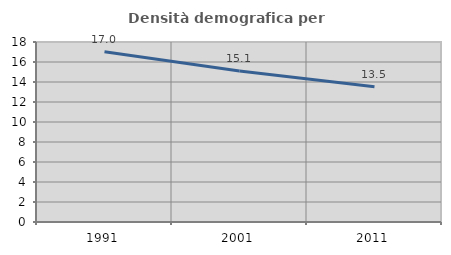
| Category | Densità demografica |
|---|---|
| 1991.0 | 17.032 |
| 2001.0 | 15.095 |
| 2011.0 | 13.523 |